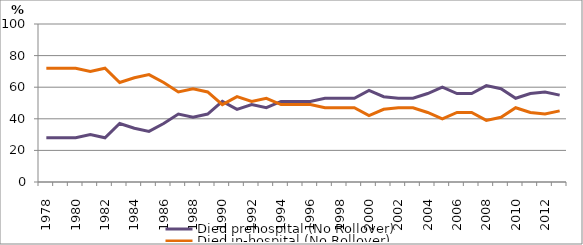
| Category | Died prehospital (No Rollover) | Died in-hospital (No Rollover) |
|---|---|---|
| 1978.0 | 28 | 72 |
| 1979.0 | 28 | 72 |
| 1980.0 | 28 | 72 |
| 1981.0 | 30 | 70 |
| 1982.0 | 28 | 72 |
| 1983.0 | 37 | 63 |
| 1984.0 | 34 | 66 |
| 1985.0 | 32 | 68 |
| 1986.0 | 37 | 63 |
| 1987.0 | 43 | 57 |
| 1988.0 | 41 | 59 |
| 1989.0 | 43 | 57 |
| 1990.0 | 51 | 49 |
| 1991.0 | 46 | 54 |
| 1992.0 | 49 | 51 |
| 1993.0 | 47 | 53 |
| 1994.0 | 51 | 49 |
| 1995.0 | 51 | 49 |
| 1996.0 | 51 | 49 |
| 1997.0 | 53 | 47 |
| 1998.0 | 53 | 47 |
| 1999.0 | 53 | 47 |
| 2000.0 | 58 | 42 |
| 2001.0 | 54 | 46 |
| 2002.0 | 53 | 47 |
| 2003.0 | 53 | 47 |
| 2004.0 | 56 | 44 |
| 2005.0 | 60 | 40 |
| 2006.0 | 56 | 44 |
| 2007.0 | 56 | 44 |
| 2008.0 | 61 | 39 |
| 2009.0 | 59 | 41 |
| 2010.0 | 53 | 47 |
| 2011.0 | 56 | 44 |
| 2012.0 | 57 | 43 |
| 2013.0 | 55 | 45 |